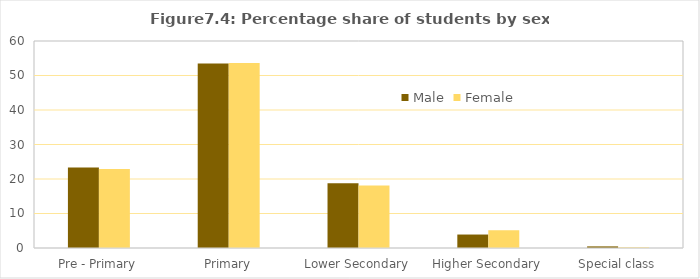
| Category | Male | Female |
|---|---|---|
| Pre - Primary | 23.35 | 22.916 |
| Primary | 53.496 | 53.604 |
| Lower Secondary | 18.782 | 18.132 |
| Higher Secondary | 3.903 | 5.148 |
| Special class | 0.468 | 0.201 |